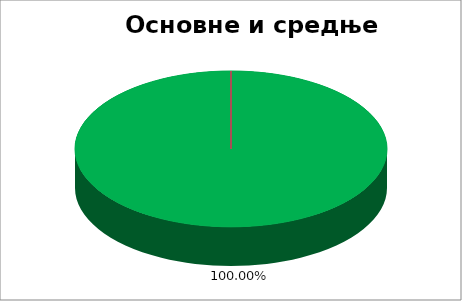
| Category | Основне и средње школе |
|---|---|
| 0 | 1 |
| 1 | 0 |
| 2 | 0 |
| 3 | 0 |
| 4 | 0 |